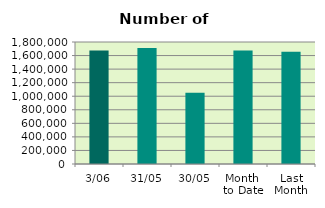
| Category | Series 0 |
|---|---|
| 3/06 | 1673736 |
| 31/05 | 1711570 |
| 30/05 | 1051698 |
| Month 
to Date | 1673736 |
| Last
Month | 1656073.545 |